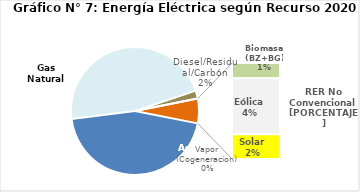
| Category | Series 0 |
|---|---|
| Agua | 2130.978 |
| Gas Natural | 2221.482 |
| Diesel/Residual/Carbón | 96.729 |
| Vapor (Cogeneracion) | 0.219 |
| Biomasa (BZ+BG) | 46.955 |
| Eólica | 172.173 |
| Solar | 76.338 |